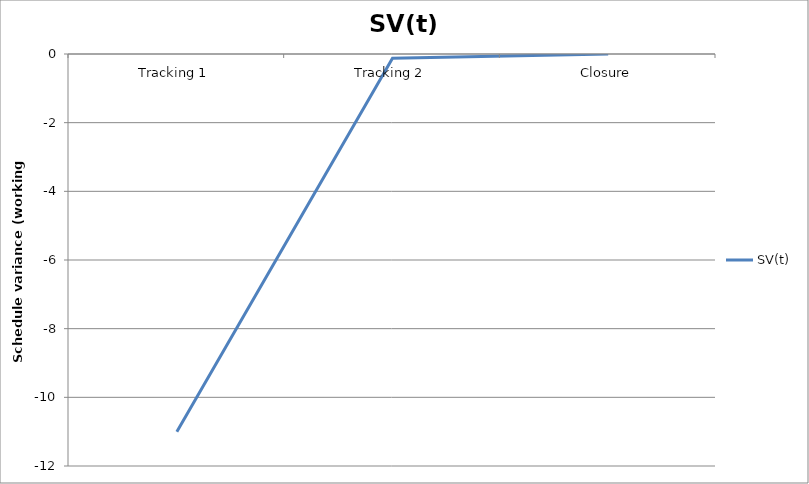
| Category | SV(t) |
|---|---|
| Tracking 1 | -11 |
| Tracking 2 | -0.125 |
| Closure | 0 |